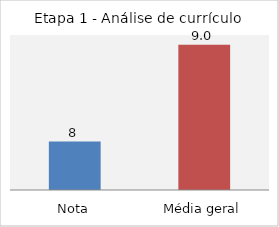
| Category | Etapa 1 - Análise de currículo |
|---|---|
| Nota | 8 |
| Média geral | 9 |